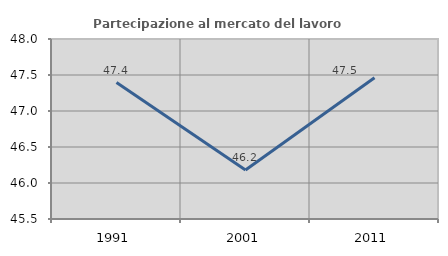
| Category | Partecipazione al mercato del lavoro  femminile |
|---|---|
| 1991.0 | 47.394 |
| 2001.0 | 46.182 |
| 2011.0 | 47.461 |